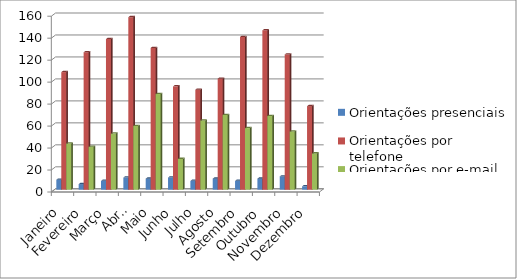
| Category | Orientações presenciais | Orientações por telefone | Orientações por e-mail |
|---|---|---|---|
| Janeiro | 9 | 107 | 42 |
| Fevereiro | 5 | 125 | 39 |
| Março | 8 | 137 | 51 |
| Abril | 11 | 157 | 58 |
| Maio | 10 | 129 | 87 |
| Junho | 11 | 94 | 28 |
| Julho | 8 | 91 | 63 |
| Agosto | 10 | 101 | 68 |
| Setembro | 8 | 139 | 56 |
| Outubro | 10 | 145 | 67 |
| Novembro | 12 | 123 | 53 |
| Dezembro | 3 | 76 | 33 |